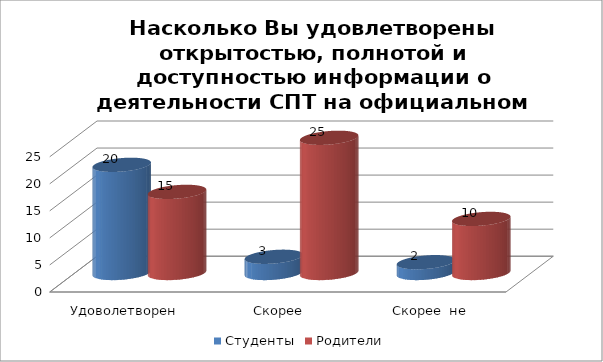
| Category | Студенты | Родители |
|---|---|---|
| Удоволетворен | 20 | 15 |
| Скорее удовлетворен | 3 | 25 |
| Скорее  не удовлетворен | 2 | 10 |